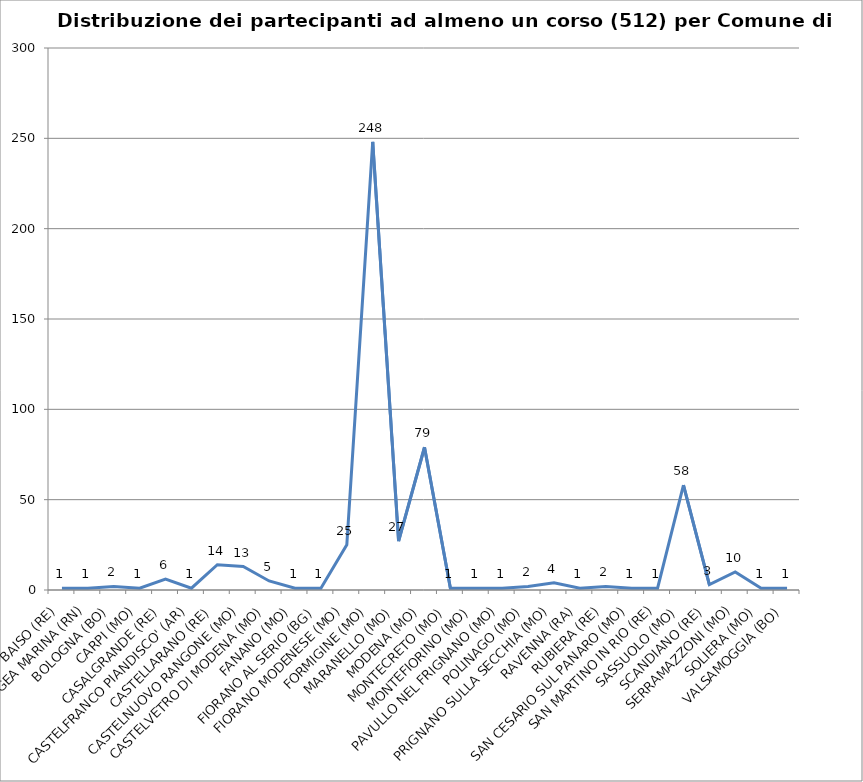
| Category | Nr. Tesserati |
|---|---|
| BAISO (RE) | 1 |
| BELLARIA-IGEA MARINA (RN) | 1 |
| BOLOGNA (BO) | 2 |
| CARPI (MO) | 1 |
| CASALGRANDE (RE) | 6 |
| CASTELFRANCO PIANDISCO' (AR) | 1 |
| CASTELLARANO (RE) | 14 |
| CASTELNUOVO RANGONE (MO) | 13 |
| CASTELVETRO DI MODENA (MO) | 5 |
| FANANO (MO) | 1 |
| FIORANO AL SERIO (BG) | 1 |
| FIORANO MODENESE (MO) | 25 |
| FORMIGINE (MO) | 248 |
| MARANELLO (MO) | 27 |
| MODENA (MO) | 79 |
| MONTECRETO (MO) | 1 |
| MONTEFIORINO (MO) | 1 |
| PAVULLO NEL FRIGNANO (MO) | 1 |
| POLINAGO (MO) | 2 |
| PRIGNANO SULLA SECCHIA (MO) | 4 |
| RAVENNA (RA) | 1 |
| RUBIERA (RE) | 2 |
| SAN CESARIO SUL PANARO (MO) | 1 |
| SAN MARTINO IN RIO (RE) | 1 |
| SASSUOLO (MO) | 58 |
| SCANDIANO (RE) | 3 |
| SERRAMAZZONI (MO) | 10 |
| SOLIERA (MO) | 1 |
| VALSAMOGGIA (BO) | 1 |